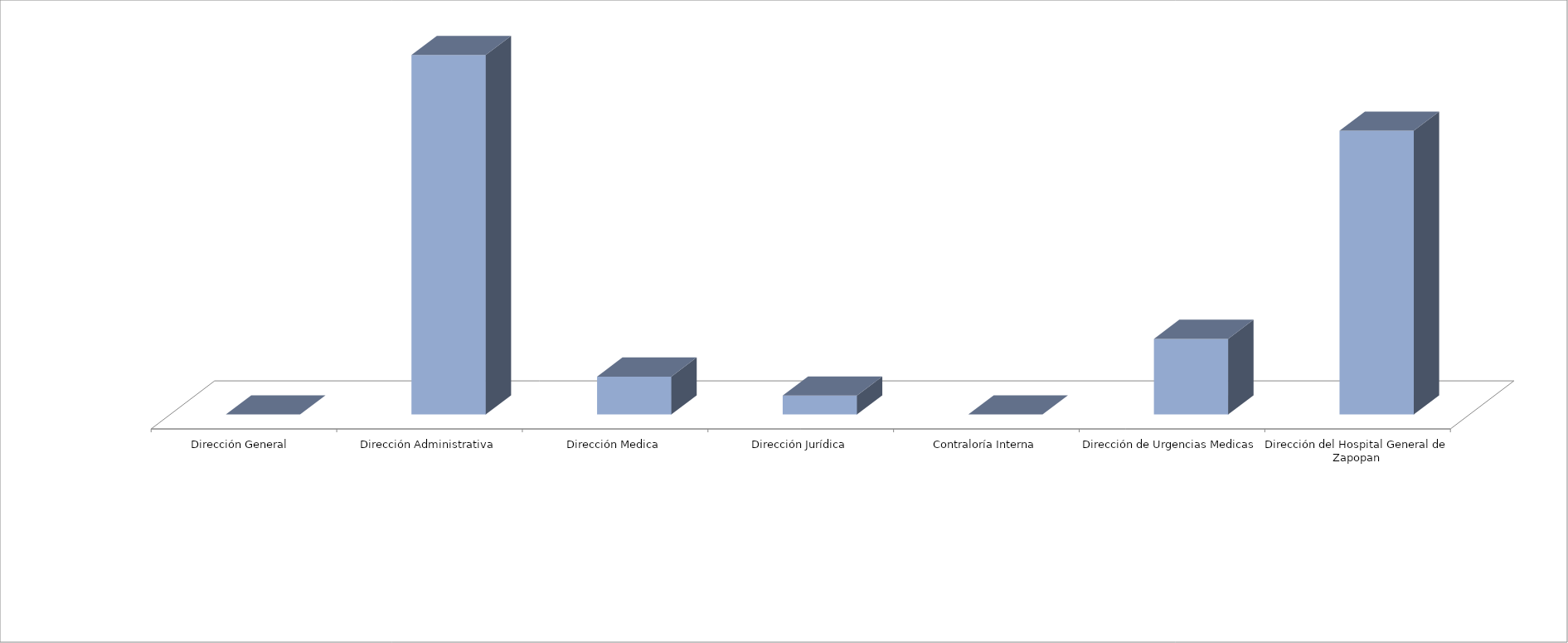
| Category | Series 0 | Series 1 |
|---|---|---|
| Dirección General  |  | 0 |
| Dirección Administrativa |  | 19 |
| Dirección Medica |  | 2 |
| Dirección Jurídica |  | 1 |
| Contraloría Interna |  | 0 |
| Dirección de Urgencias Medicas |  | 4 |
| Dirección del Hospital General de Zapopan |  | 15 |